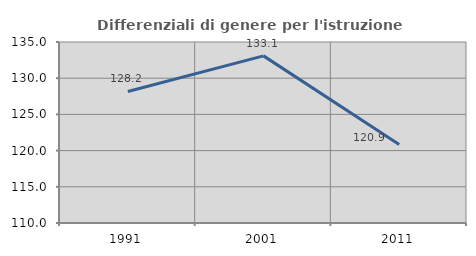
| Category | Differenziali di genere per l'istruzione superiore |
|---|---|
| 1991.0 | 128.168 |
| 2001.0 | 133.083 |
| 2011.0 | 120.857 |